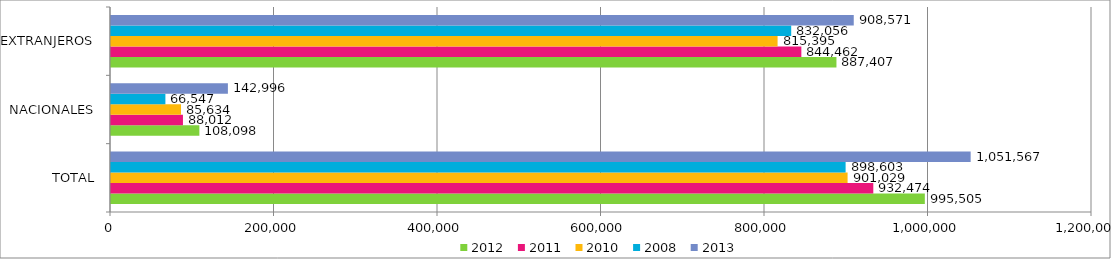
| Category | 2012 | 2011 | 2010 | 2008 | 2013 |
|---|---|---|---|---|---|
| TOTAL | 995505 | 932474 | 901029 | 898603 | 1051567 |
| NACIONALES | 108098 | 88012 | 85634 | 66547 | 142996 |
| EXTRANJEROS | 887407 | 844462 | 815395 | 832056 | 908571 |